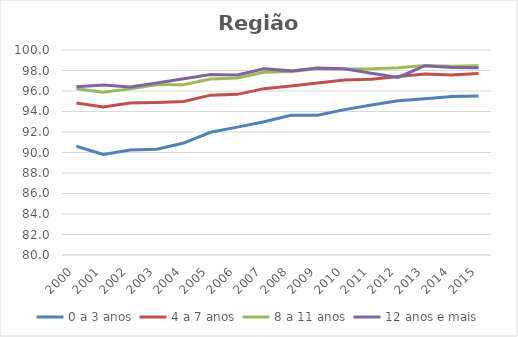
| Category | 0 a 3 anos | 4 a 7 anos | 8 a 11 anos | 12 anos e mais |
|---|---|---|---|---|
| 2000.0 | 90.612 | 94.829 | 96.225 | 96.408 |
| 2001.0 | 89.804 | 94.441 | 95.867 | 96.575 |
| 2002.0 | 90.236 | 94.821 | 96.206 | 96.386 |
| 2003.0 | 90.309 | 94.886 | 96.619 | 96.789 |
| 2004.0 | 90.923 | 94.981 | 96.617 | 97.202 |
| 2005.0 | 91.976 | 95.597 | 97.159 | 97.601 |
| 2006.0 | 92.475 | 95.671 | 97.271 | 97.563 |
| 2007.0 | 93.005 | 96.23 | 97.825 | 98.168 |
| 2008.0 | 93.64 | 96.496 | 97.904 | 97.964 |
| 2009.0 | 93.646 | 96.79 | 98.175 | 98.242 |
| 2010.0 | 94.182 | 97.067 | 98.156 | 98.179 |
| 2011.0 | 94.636 | 97.137 | 98.166 | 97.723 |
| 2012.0 | 95.042 | 97.419 | 98.258 | 97.33 |
| 2013.0 | 95.235 | 97.668 | 98.476 | 98.467 |
| 2014.0 | 95.472 | 97.552 | 98.409 | 98.295 |
| 2015.0 | 95.512 | 97.71 | 98.469 | 98.265 |